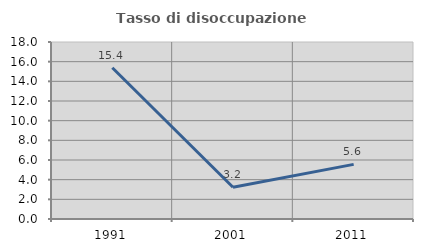
| Category | Tasso di disoccupazione giovanile  |
|---|---|
| 1991.0 | 15.385 |
| 2001.0 | 3.226 |
| 2011.0 | 5.556 |